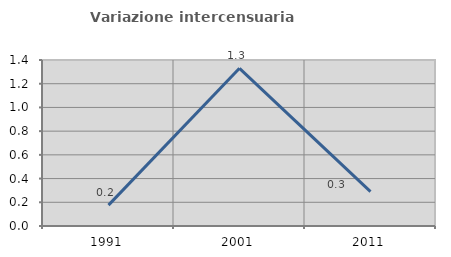
| Category | Variazione intercensuaria annua |
|---|---|
| 1991.0 | 0.176 |
| 2001.0 | 1.33 |
| 2011.0 | 0.289 |